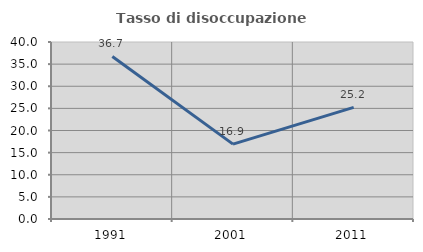
| Category | Tasso di disoccupazione giovanile  |
|---|---|
| 1991.0 | 36.735 |
| 2001.0 | 16.923 |
| 2011.0 | 25.217 |